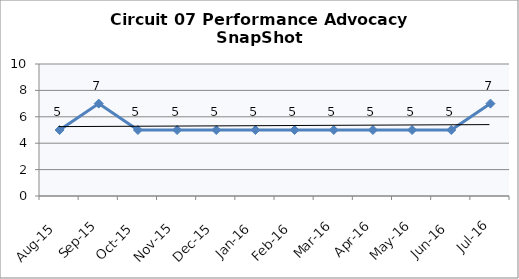
| Category | Circuit 07 |
|---|---|
| Aug-15 | 5 |
| Sep-15 | 7 |
| Oct-15 | 5 |
| Nov-15 | 5 |
| Dec-15 | 5 |
| Jan-16 | 5 |
| Feb-16 | 5 |
| Mar-16 | 5 |
| Apr-16 | 5 |
| May-16 | 5 |
| Jun-16 | 5 |
| Jul-16 | 7 |